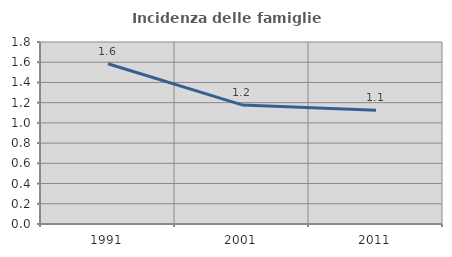
| Category | Incidenza delle famiglie numerose |
|---|---|
| 1991.0 | 1.585 |
| 2001.0 | 1.178 |
| 2011.0 | 1.124 |